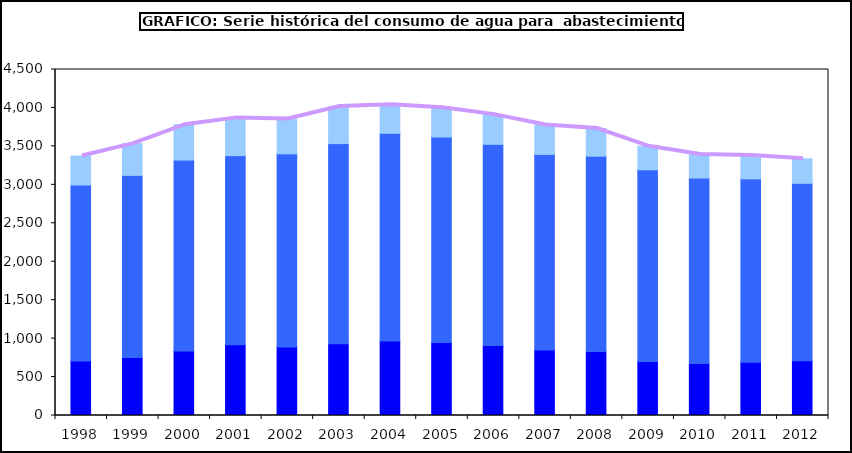
| Category | Sectores económicos  | Hogares  | Consumos municipales y otros |
|---|---|---|---|
| 1998.0 | 709.49 | 2288.712 | 376.609 |
| 1999.0 | 754.551 | 2368.128 | 413.039 |
| 2000.0 | 840.165 | 2482.085 | 459.43 |
| 2001.0 | 920.127 | 2459.548 | 490.975 |
| 2002.0 | 891.039 | 2511.81 | 452.848 |
| 2003.0 | 933.309 | 2602.904 | 483.402 |
| 2004.0 | 969.34 | 2700.928 | 372.131 |
| 2005.0 | 947.955 | 2673.564 | 380.661 |
| 2006.0 | 911.264 | 2615.751 | 386.044 |
| 2007.0 | 852.276 | 2543.714 | 382.046 |
| 2008.0 | 832.701 | 2539.891 | 358.807 |
| 2009.0 | 701.655 | 2493.842 | 305.081 |
| 2010.0 | 675.454 | 2412.708 | 305.109 |
| 2011.0 | 693.42 | 2384.386 | 303.512 |
| 2012.0 | 711 | 2309 | 318 |